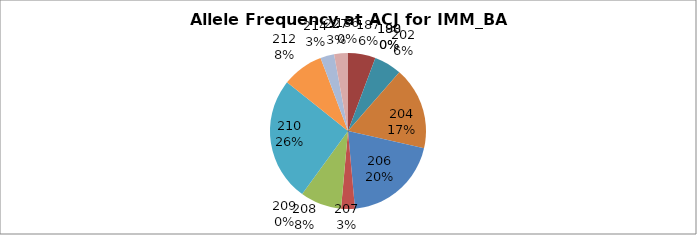
| Category | Series 0 |
|---|---|
| 186.0 | 0 |
| 187.0 | 0.057 |
| 188.0 | 0 |
| 190.0 | 0 |
| 202.0 | 0.057 |
| 204.0 | 0.171 |
| 206.0 | 0.2 |
| 207.0 | 0.029 |
| 208.0 | 0.086 |
| 209.0 | 0 |
| 210.0 | 0.257 |
| 212.0 | 0.086 |
| 214.0 | 0.029 |
| 227.0 | 0.029 |